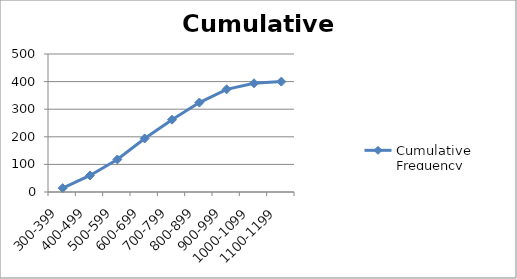
| Category | Cumulative Frequency |
|---|---|
| 300-399 | 14 |
| 400-499 | 60 |
| 500-599 | 118 |
| 600-699 | 194 |
| 700-799 | 262 |
| 800-899 | 324 |
| 900-999 | 372 |
| 1000-1099 | 394 |
| 1100-1199 | 400 |